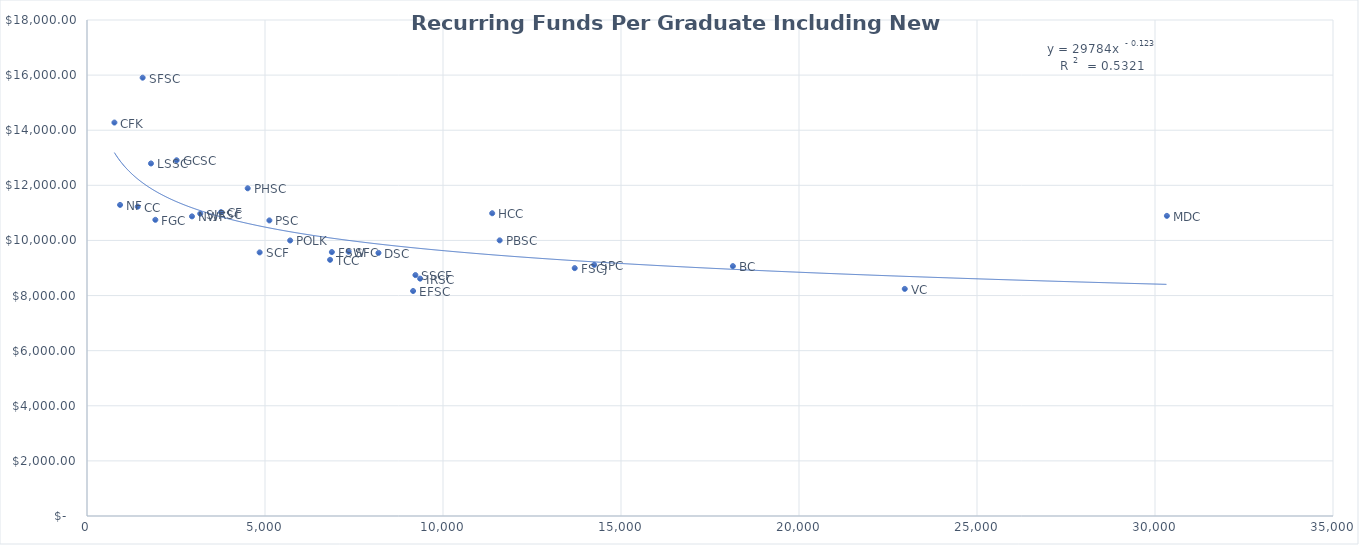
| Category |  Recurring Funds Per Graduate Including New Distributions |
|---|---|
| 770.0 | 14278.503 |
| 929.0 | 11289.64 |
| 1424.0 | 11227.298 |
| 1563.0 | 15906.369 |
| 1797.0 | 12793.673 |
| 1920.0 | 10748.389 |
| 2518.0 | 12909.051 |
| 2949.0 | 10873.576 |
| 3181.0 | 10971.523 |
| 3765.0 | 11026.02 |
| 4514.0 | 11892.127 |
| 4850.0 | 9565.957 |
| 5123.0 | 10726.785 |
| 5707.0 | 9998.733 |
| 6828.0 | 9296.855 |
| 6878.0 | 9578.126 |
| 7350.0 | 9591.424 |
| 8187.0 | 9547.983 |
| 9160.0 | 8165.114 |
| 9225.0 | 8742.687 |
| 9357.0 | 8614.098 |
| 11382.0 | 10986.551 |
| 11592.0 | 10002.747 |
| 13700.0 | 8995.476 |
| 14247.0 | 9113.299 |
| 18143.0 | 9067.468 |
| 22971.0 | 8241.415 |
| 30334.0 | 10891.584 |